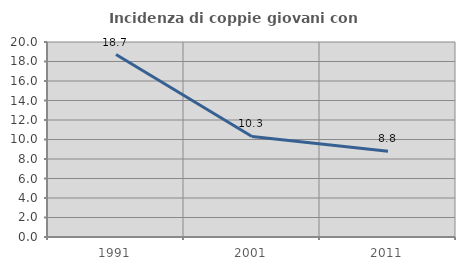
| Category | Incidenza di coppie giovani con figli |
|---|---|
| 1991.0 | 18.717 |
| 2001.0 | 10.309 |
| 2011.0 | 8.791 |